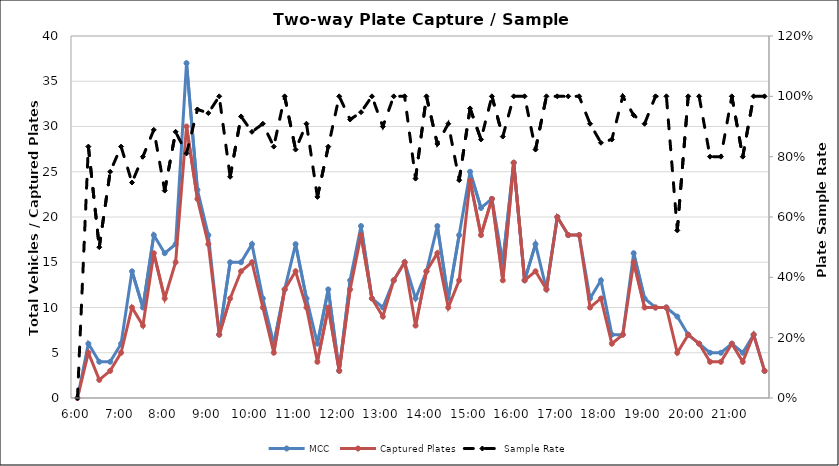
| Category | MCC | Captured Plates |
|---|---|---|
| 0.25 | 0 | 0 |
| 0.260416666666667 | 6 | 5 |
| 0.270833333333333 | 4 | 2 |
| 0.28125 | 4 | 3 |
| 0.291666666666667 | 6 | 5 |
| 0.302083333333333 | 14 | 10 |
| 0.3125 | 10 | 8 |
| 0.322916666666667 | 18 | 16 |
| 0.333333333333333 | 16 | 11 |
| 0.34375 | 17 | 15 |
| 0.354166666666667 | 37 | 30 |
| 0.364583333333333 | 23 | 22 |
| 0.375 | 18 | 17 |
| 0.385416666666667 | 7 | 7 |
| 0.395833333333333 | 15 | 11 |
| 0.40625 | 15 | 14 |
| 0.416666666666667 | 17 | 15 |
| 0.427083333333333 | 11 | 10 |
| 0.4375 | 6 | 5 |
| 0.447916666666667 | 12 | 12 |
| 0.458333333333333 | 17 | 14 |
| 0.46875 | 11 | 10 |
| 0.479166666666667 | 6 | 4 |
| 0.489583333333333 | 12 | 10 |
| 0.5 | 3 | 3 |
| 0.510416666666667 | 13 | 12 |
| 0.520833333333333 | 19 | 18 |
| 0.53125 | 11 | 11 |
| 0.541666666666667 | 10 | 9 |
| 0.552083333333333 | 13 | 13 |
| 0.5625 | 15 | 15 |
| 0.572916666666667 | 11 | 8 |
| 0.583333333333333 | 14 | 14 |
| 0.59375 | 19 | 16 |
| 0.604166666666667 | 11 | 10 |
| 0.614583333333333 | 18 | 13 |
| 0.625 | 25 | 24 |
| 0.635416666666667 | 21 | 18 |
| 0.645833333333333 | 22 | 22 |
| 0.65625 | 15 | 13 |
| 0.666666666666667 | 26 | 26 |
| 0.677083333333333 | 13 | 13 |
| 0.6875 | 17 | 14 |
| 0.697916666666667 | 12 | 12 |
| 0.708333333333333 | 20 | 20 |
| 0.71875 | 18 | 18 |
| 0.729166666666667 | 18 | 18 |
| 0.739583333333333 | 11 | 10 |
| 0.75 | 13 | 11 |
| 0.760416666666667 | 7 | 6 |
| 0.770833333333333 | 7 | 7 |
| 0.78125 | 16 | 15 |
| 0.791666666666667 | 11 | 10 |
| 0.802083333333333 | 10 | 10 |
| 0.8125 | 10 | 10 |
| 0.822916666666667 | 9 | 5 |
| 0.833333333333333 | 7 | 7 |
| 0.84375 | 6 | 6 |
| 0.854166666666667 | 5 | 4 |
| 0.864583333333333 | 5 | 4 |
| 0.875 | 6 | 6 |
| 0.885416666666667 | 5 | 4 |
| 0.895833333333333 | 7 | 7 |
| 0.90625 | 3 | 3 |